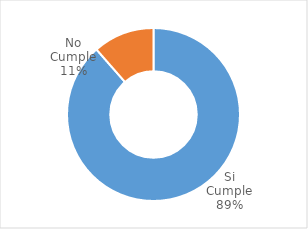
| Category | Series 0 |
|---|---|
| Si Cumple | 0.885 |
| No Cumple | 0.115 |